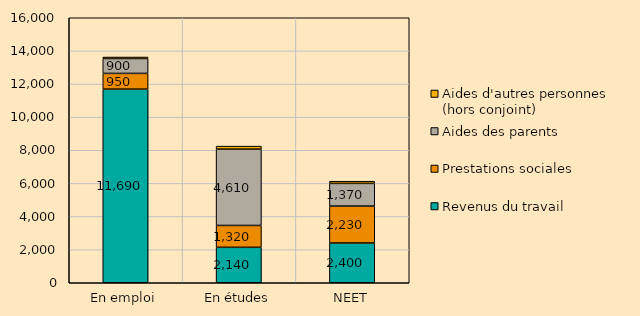
| Category | Revenus du travail | Prestations sociales | Aides des parents | Aides d'autres personnes (hors conjoint) |
|---|---|---|---|---|
| En emploi | 11690 | 950 | 900 | 90 |
| En études | 2140 | 1320 | 4610 | 180 |
| NEET | 2400 | 2230 | 1370 | 130 |